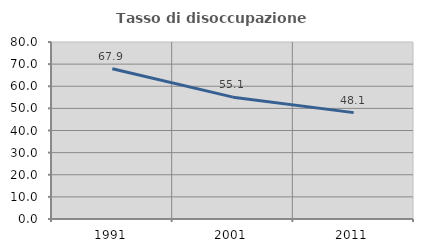
| Category | Tasso di disoccupazione giovanile  |
|---|---|
| 1991.0 | 67.895 |
| 2001.0 | 55.072 |
| 2011.0 | 48.077 |